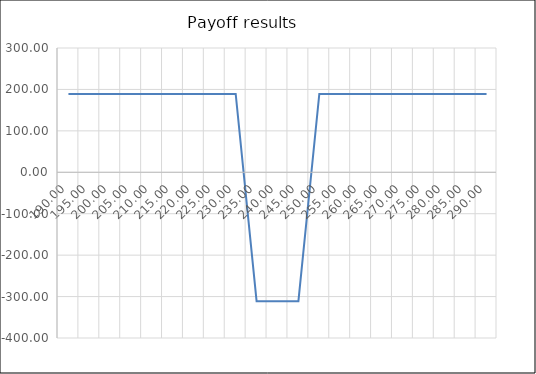
| Category | Net Payoff  |
|---|---|
| 190.0 | 189 |
| 195.0 | 189 |
| 200.0 | 189 |
| 205.0 | 189 |
| 210.0 | 189 |
| 215.0 | 189 |
| 220.0 | 189 |
| 225.0 | 189 |
| 230.0 | 189 |
| 235.0 | -311 |
| 240.0 | -311 |
| 245.0 | -311 |
| 250.0 | 189 |
| 255.0 | 189 |
| 260.0 | 189 |
| 265.0 | 189 |
| 270.0 | 189 |
| 275.0 | 189 |
| 280.0 | 189 |
| 285.0 | 189 |
| 290.0 | 189 |